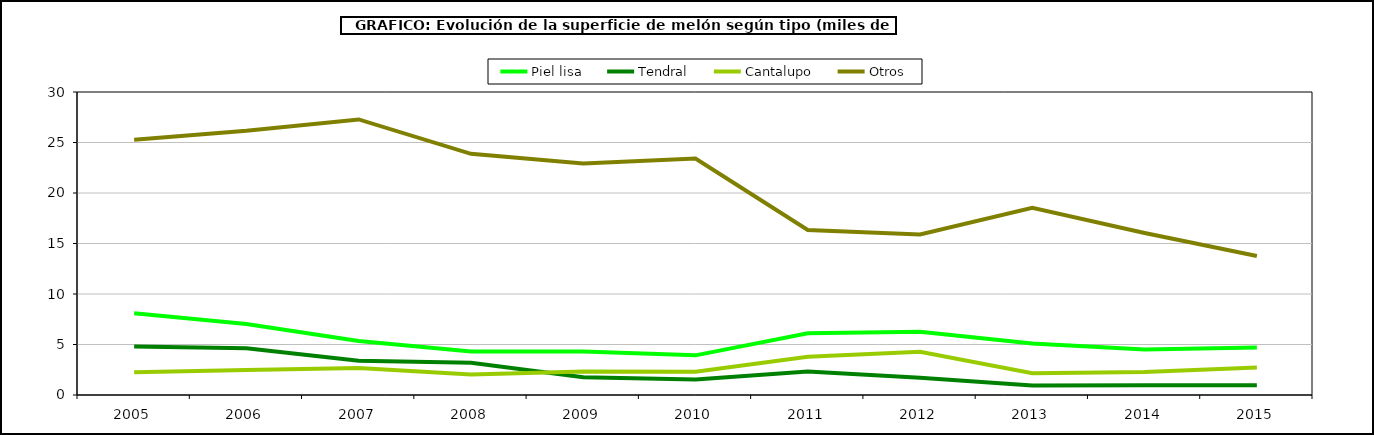
| Category | Piel lisa | Tendral | Cantalupo | Otros |
|---|---|---|---|---|
| 2005.0 | 8.095 | 4.791 | 2.253 | 25.284 |
| 2006.0 | 7.038 | 4.625 | 2.474 | 26.157 |
| 2007.0 | 5.353 | 3.385 | 2.669 | 27.281 |
| 2008.0 | 4.312 | 3.181 | 2.02 | 23.875 |
| 2009.0 | 4.319 | 1.755 | 2.33 | 22.923 |
| 2010.0 | 3.925 | 1.546 | 2.308 | 23.409 |
| 2011.0 | 6.109 | 2.318 | 3.791 | 16.343 |
| 2012.0 | 6.265 | 1.708 | 4.27 | 15.887 |
| 2013.0 | 5.109 | 0.939 | 2.152 | 18.523 |
| 2014.0 | 4.503 | 0.973 | 2.277 | 16.047 |
| 2015.0 | 4.698 | 0.96 | 2.723 | 13.763 |